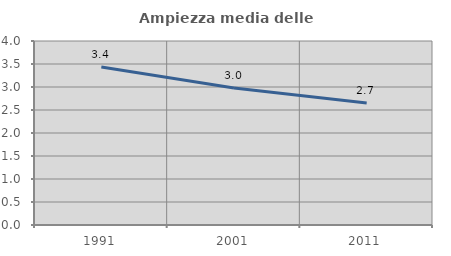
| Category | Ampiezza media delle famiglie |
|---|---|
| 1991.0 | 3.437 |
| 2001.0 | 2.978 |
| 2011.0 | 2.652 |